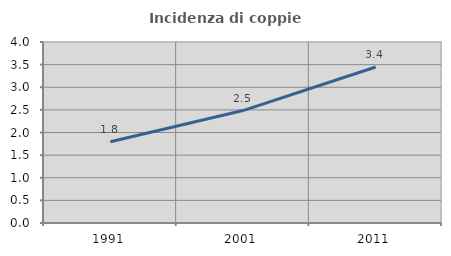
| Category | Incidenza di coppie miste |
|---|---|
| 1991.0 | 1.794 |
| 2001.0 | 2.484 |
| 2011.0 | 3.448 |